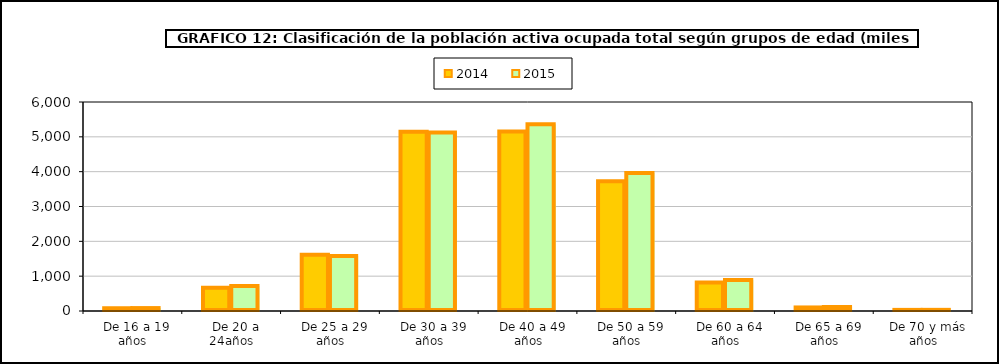
| Category | 2014 | 2015 |
|---|---|---|
|   De 16 a 19 años | 79.4 | 83.825 |
|   De 20 a 24años | 669.2 | 718.85 |
|   De 25 a 29 años | 1616.8 | 1577.65 |
|   De 30 a 39 años | 5147.6 | 5124.45 |
|   De 40 a 49 años | 5152.2 | 5362.08 |
|   De 50 a 59 años | 3724.5 | 3961.2 |
|   De 60 a 64 años | 820.9 | 889.4 |
|   De 65 a 69 años | 101.8 | 115.55 |
|   De 70 y más años | 31.9 | 33 |